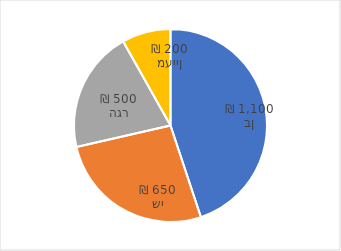
| Category | Series 0 |
|---|---|
| בן | 1100 |
| שי | 650 |
| הגר | 500 |
| מעיין | 200 |